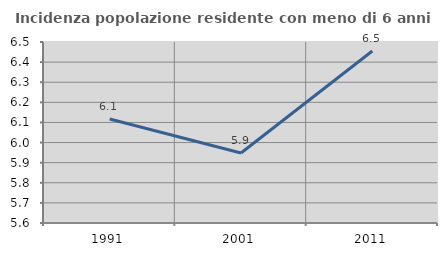
| Category | Incidenza popolazione residente con meno di 6 anni |
|---|---|
| 1991.0 | 6.117 |
| 2001.0 | 5.948 |
| 2011.0 | 6.455 |